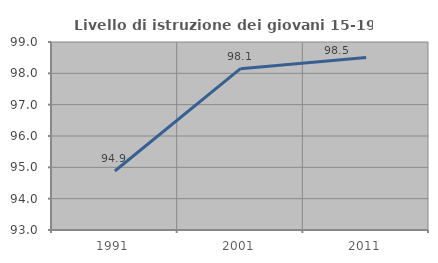
| Category | Livello di istruzione dei giovani 15-19 anni |
|---|---|
| 1991.0 | 94.884 |
| 2001.0 | 98.148 |
| 2011.0 | 98.507 |